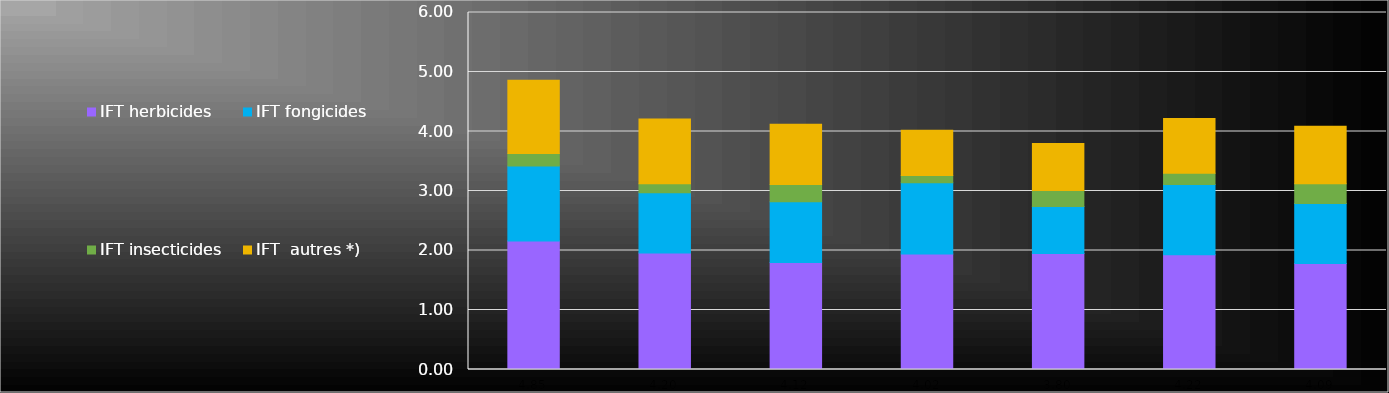
| Category | IFT herbicides | IFT fongicides | IFT insecticides | IFT  autres *) |
|---|---|---|---|---|
| 4.85 | 2.16 | 1.26 | 0.21 | 1.23 |
| 4.2 | 1.96 | 1.01 | 0.15 | 1.09 |
| 4.12 | 1.8 | 1.02 | 0.29 | 1.01 |
| 4.02 | 1.94 | 1.2 | 0.12 | 0.76 |
| 3.8 | 1.95 | 0.79 | 0.27 | 0.79 |
| 4.22 | 1.93 | 1.18 | 0.19 | 0.92 |
| 4.09 | 1.78 | 1.01 | 0.33 | 0.97 |